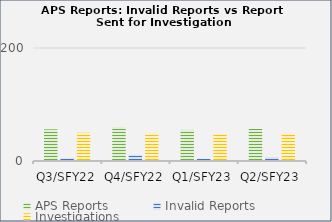
| Category | APS Reports | Invalid Reports | Investigations |
|---|---|---|---|
| Q3/SFY22 | 56 | 5 | 50 |
| Q4/SFY22 | 60 | 11 | 49 |
| Q1/SFY23 | 55 | 4 | 48 |
| Q2/SFY23 | 57 | 7 | 49 |